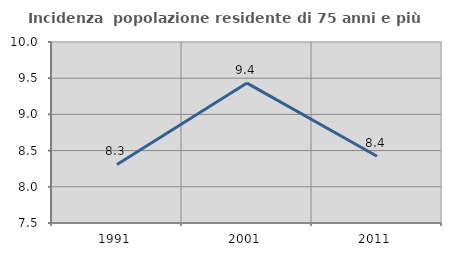
| Category | Incidenza  popolazione residente di 75 anni e più |
|---|---|
| 1991.0 | 8.309 |
| 2001.0 | 9.433 |
| 2011.0 | 8.422 |